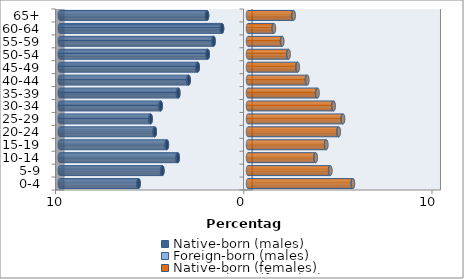
| Category | Native-born (males) | Foreign-born (males) | Native-born (females) | Foreign-born (females) |
|---|---|---|---|---|
| 0-4 | -5.809 | -0.024 | 5.562 | 0.018 |
| 5-9 | -4.545 | -0.022 | 4.359 | 0.017 |
| 10-14 | -3.731 | -0.022 | 3.582 | 0.018 |
| 15-19 | -4.308 | -0.025 | 4.145 | 0.019 |
| 20-24 | -4.949 | -0.028 | 4.804 | 0.02 |
| 25-29 | -5.168 | -0.032 | 5.03 | 0.023 |
| 30-34 | -4.635 | -0.035 | 4.53 | 0.026 |
| 35-39 | -3.699 | -0.035 | 3.67 | 0.028 |
| 40-44 | -3.148 | -0.034 | 3.128 | 0.029 |
| 45-49 | -2.67 | -0.031 | 2.621 | 0.027 |
| 50-54 | -2.137 | -0.027 | 2.134 | 0.025 |
| 55-59 | -1.826 | -0.023 | 1.802 | 0.021 |
| 60-64 | -1.378 | -0.018 | 1.361 | 0.017 |
| 65+ | -2.172 | -0.022 | 2.406 | 0.022 |